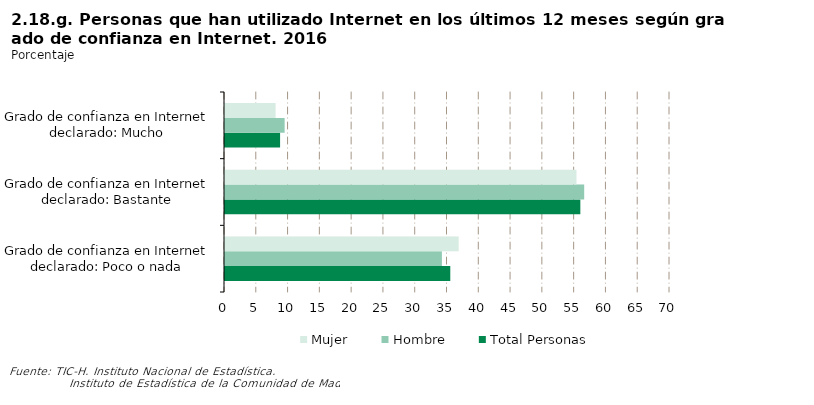
| Category | Total Personas | Hombre | Mujer |
|---|---|---|---|
| Grado de confianza en Internet declarado: Poco o nada | 35.438 | 34.116 | 36.758 |
| Grado de confianza en Internet declarado: Bastante | 55.896 | 56.503 | 55.289 |
| Grado de confianza en Internet declarado: Mucho | 8.666 | 9.381 | 7.953 |